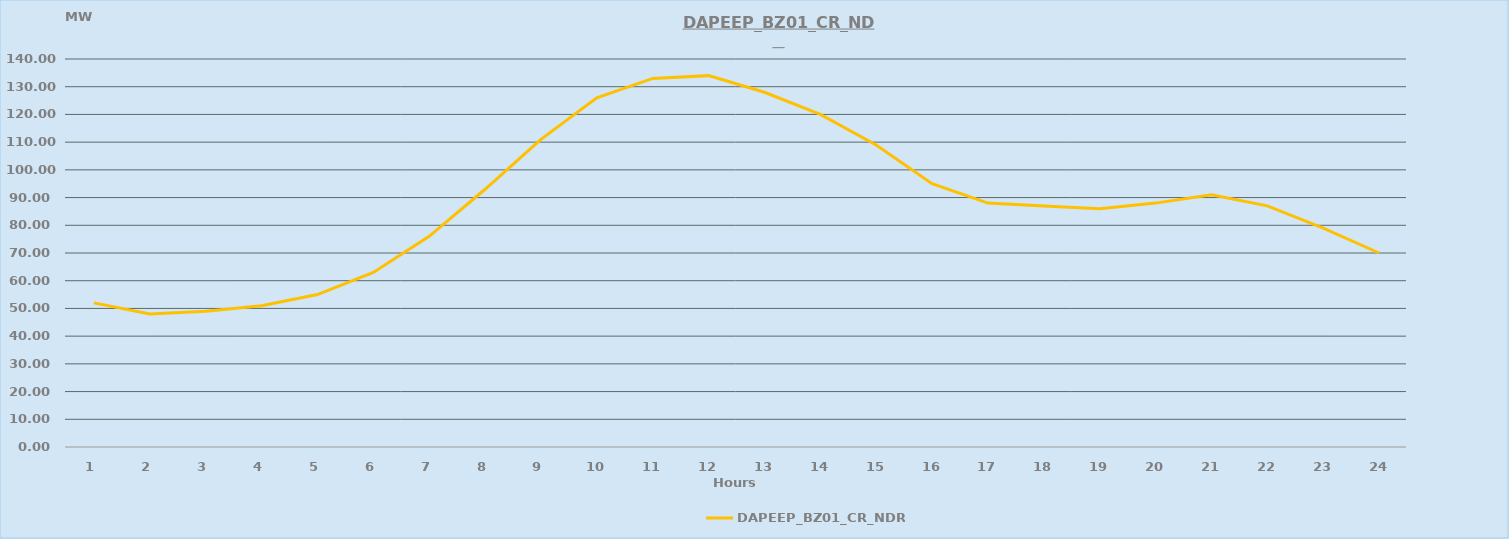
| Category | DAPEEP_BZ01_CR_NDR |
|---|---|
| 0 | 52 |
| 1 | 48 |
| 2 | 49 |
| 3 | 51 |
| 4 | 55 |
| 5 | 63 |
| 6 | 76 |
| 7 | 93 |
| 8 | 111 |
| 9 | 126 |
| 10 | 133 |
| 11 | 134 |
| 12 | 128 |
| 13 | 120 |
| 14 | 109 |
| 15 | 95 |
| 16 | 88 |
| 17 | 87 |
| 18 | 86 |
| 19 | 88 |
| 20 | 91 |
| 21 | 87 |
| 22 | 79 |
| 23 | 70 |